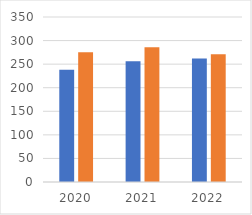
| Category | Ist | Soll |
|---|---|---|
| 2020.0 | 238 | 275 |
| 2021.0 | 256 | 286 |
| 2022.0 | 262 | 271 |